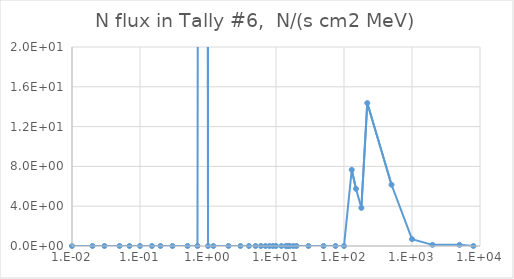
| Category | Series 0 |
|---|---|
| 1e-09 | 0 |
| 1e-08 | 0 |
| 2.5e-08 | 0 |
| 1e-07 | 0 |
| 2e-07 | 0 |
| 5e-07 | 0 |
| 1e-06 | 0 |
| 2e-06 | 0 |
| 5e-06 | 0 |
| 1e-05 | 0 |
| 2e-05 | 0 |
| 5e-05 | 0 |
| 0.0001 | 0 |
| 0.0002 | 0 |
| 0.0005 | 0 |
| 0.001 | 0 |
| 0.002 | 0 |
| 0.005 | 0 |
| 0.01 | 0 |
| 0.02 | 0 |
| 0.03 | 0 |
| 0.05 | 0 |
| 0.07 | 0 |
| 0.1 | 0 |
| 0.15 | 0 |
| 0.2 | 0 |
| 0.3 | 0 |
| 0.5 | 0 |
| 0.7 | 0 |
| 0.9 | 544.71 |
| 1.0 | 0 |
| 1.2 | 0 |
| 2.0 | 0 |
| 3.0 | 0 |
| 4.0 | 0 |
| 5.0 | 0 |
| 6.0 | 0 |
| 7.0 | 0 |
| 8.0 | 0 |
| 9.0 | 0 |
| 10.0 | 0 |
| 12.0 | 0 |
| 14.0 | 0 |
| 15.0 | 0 |
| 16.0 | 0 |
| 18.0 | 0 |
| 20.0 | 0 |
| 30.0 | 0 |
| 50.0 | 0 |
| 75.0 | 0 |
| 100.0 | 0 |
| 130.0 | 7.661 |
| 150.0 | 5.746 |
| 180.0 | 3.83 |
| 220.0 | 14.364 |
| 500.0 | 6.156 |
| 1000.0 | 0.689 |
| 2000.0 | 0.115 |
| 5000.0 | 0.115 |
| 8000.0 | 0 |